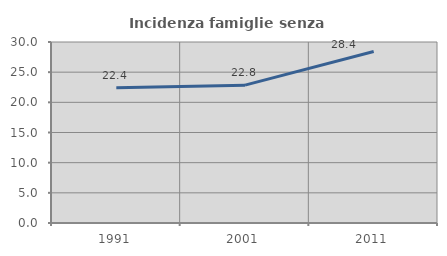
| Category | Incidenza famiglie senza nuclei |
|---|---|
| 1991.0 | 22.426 |
| 2001.0 | 22.845 |
| 2011.0 | 28.415 |